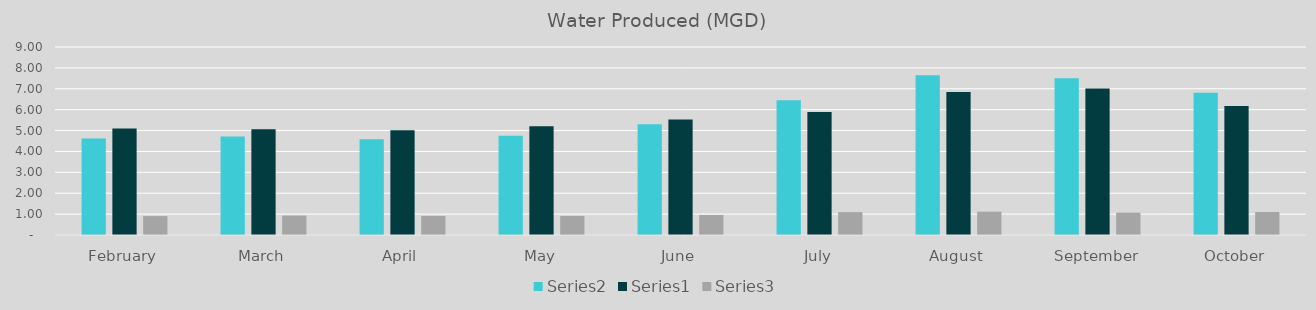
| Category | Series 1 | Series 0 | Series 2 |
|---|---|---|---|
| February | 4.62 | 5.1 | 0.906 |
| March | 4.71 | 5.06 | 0.931 |
| April | 4.58 | 5.01 | 0.914 |
| May | 4.75 | 5.21 | 0.912 |
| June | 5.3 | 5.53 | 0.958 |
| July | 6.45 | 5.89 | 1.095 |
| August | 7.65 | 6.85 | 1.117 |
| September | 7.5 | 7.01 | 1.07 |
| October | 6.81 | 6.18 | 1.102 |